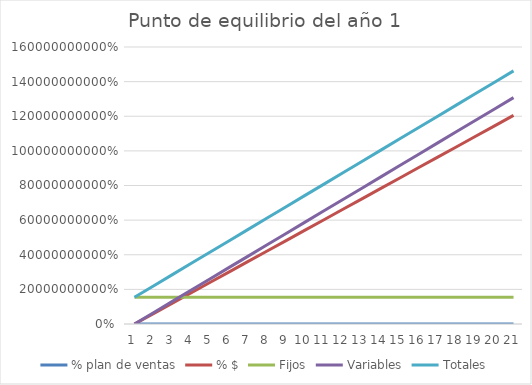
| Category | % plan de ventas | % $ | Fijos | Variables | Totales |
|---|---|---|---|---|---|
| 0 | 0 | 0 | 154365134.062 | 0 | 154365134.062 |
| 1 | 0.05 | 60243750 | 154365134.062 | 65377307.347 | 219742441.409 |
| 2 | 0.1 | 120487500 | 154365134.062 | 130754614.694 | 285119748.756 |
| 3 | 0.15 | 180731250 | 154365134.062 | 196131922.041 | 350497056.104 |
| 4 | 0.2 | 240975000 | 154365134.062 | 261509229.389 | 415874363.451 |
| 5 | 0.25 | 301218750 | 154365134.062 | 326886536.736 | 481251670.798 |
| 6 | 0.3 | 361462500 | 154365134.062 | 392263844.083 | 546628978.145 |
| 7 | 0.35 | 421706250 | 154365134.062 | 457641151.43 | 612006285.492 |
| 8 | 0.4 | 481950000 | 154365134.062 | 523018458.777 | 677383592.839 |
| 9 | 0.45 | 542193750 | 154365134.062 | 588395766.124 | 742760900.186 |
| 10 | 0.5 | 602437500 | 154365134.062 | 653773073.471 | 808138207.534 |
| 11 | 0.55 | 662681250 | 154365134.062 | 719150380.819 | 873515514.881 |
| 12 | 0.6 | 722925000 | 154365134.062 | 784527688.166 | 938892822.228 |
| 13 | 0.65 | 783168750 | 154365134.062 | 849904995.513 | 1004270129.575 |
| 14 | 0.7 | 843412500 | 154365134.062 | 915282302.86 | 1069647436.922 |
| 15 | 0.75 | 903656250 | 154365134.062 | 980659610.207 | 1135024744.269 |
| 16 | 0.8 | 963900000 | 154365134.062 | 1046036917.554 | 1200402051.616 |
| 17 | 0.85 | 1024143750 | 154365134.062 | 1111414224.901 | 1265779358.964 |
| 18 | 0.9 | 1084387500 | 154365134.062 | 1176791532.249 | 1331156666.311 |
| 19 | 0.95 | 1144631250 | 154365134.062 | 1242168839.596 | 1396533973.658 |
| 20 | 1 | 1204875000 | 154365134.062 | 1307546146.943 | 1461911281.005 |